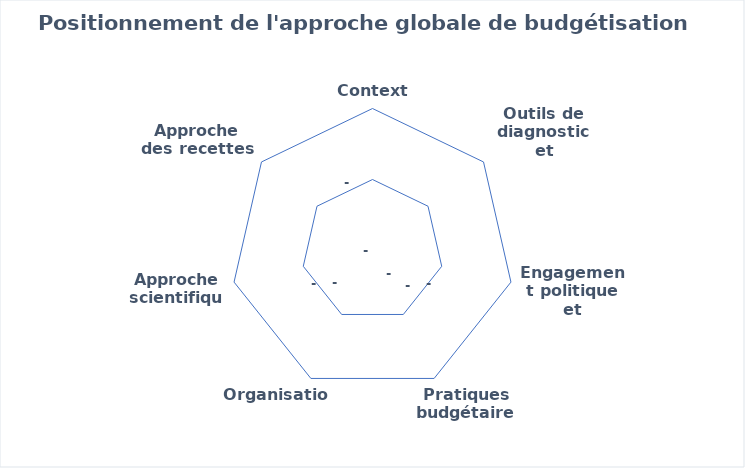
| Category | Series 3 |
|---|---|
| Contexte | 0 |
| Outils de diagnostic et indicateurs | 0 |
| Engagement politique et administratif | 0 |
| Pratiques budgétaires | 0 |
| Organisation | 0 |
| Approche scientifique | 0 |
| Approche des recettes | 0 |